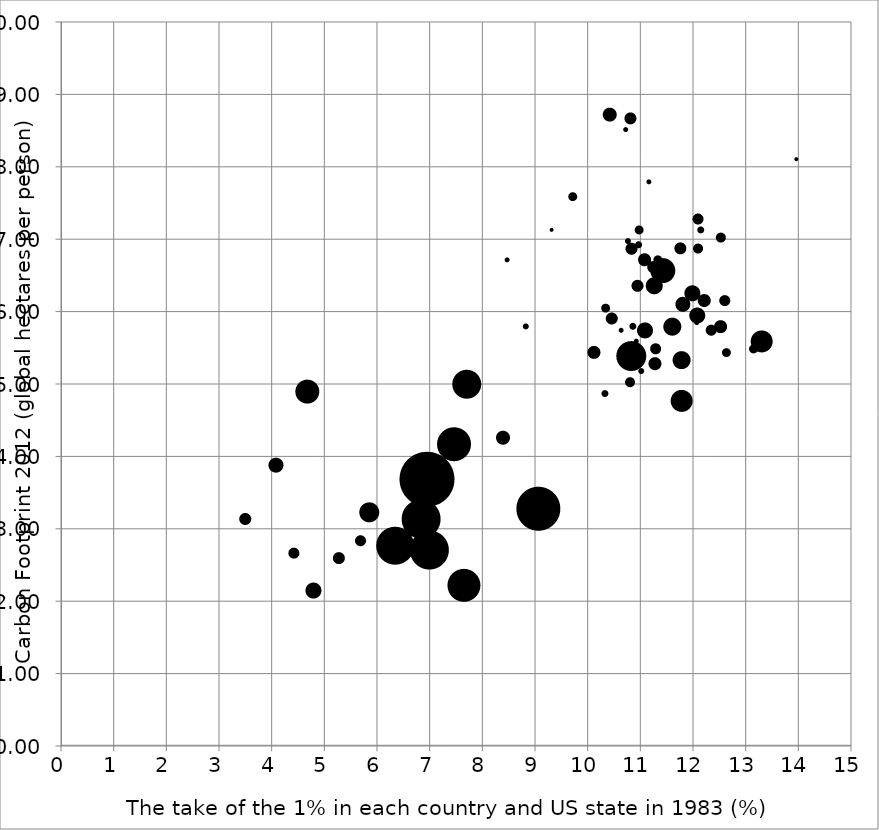
| Category | Series 0 |
|---|---|
| 12.342149 | 5.746 |
| 8.4618807 | 6.721 |
| 11.272208 | 5.284 |
| 12.627508 | 5.438 |
| 10.827101 | 5.387 |
| 10.823525 | 6.875 |
| 12.519849 | 7.029 |
| 10.718918 | 8.517 |
| 13.960412 | 8.106 |
| 13.298127 | 5.592 |
| 12.073452 | 5.951 |
| 8.8225587 | 5.797 |
| 10.319641 | 4.874 |
| 11.599077 | 5.797 |
| 11.073858 | 6.721 |
| 10.971814 | 7.131 |
| 11.324685 | 6.721 |
| 12.086685 | 7.285 |
| 12.596983 | 6.157 |
| 11.013192 | 5.182 |
| 10.809328 | 8.67 |
| 12.208504 | 6.157 |
| 11.079764 | 5.746 |
| 10.938519 | 6.362 |
| 13.142256 | 5.49 |
| 11.757833 | 6.875 |
| 10.921436 | 5.592 |
| 10.963338 | 6.926 |
| 10.332483 | 6.054 |
| 10.759662 | 6.977 |
| 11.801322 | 6.105 |
| 10.857477 | 5.797 |
| 11.7783 | 4.771 |
| 11.979431 | 6.259 |
| 11.154256 | 7.798 |
| 11.258063 | 6.362 |
| 12.09054 | 6.875 |
| 10.800268 | 5.028 |
| 11.774806 | 5.336 |
| 12.069936 | 5.849 |
| 11.285991 | 5.49 |
| 10.630249 | 5.746 |
| 12.516923 | 5.797 |
| 11.42572 | 6.567 |
| 9.7092366 | 7.593 |
| 10.723032 | 5.233 |
| 10.41725 | 8.722 |
| 10.116898 | 5.438 |
| 12.142691 | 7.131 |
| 11.23925 | 6.618 |
| 9.311722 | 7.131 |
| 4.67 | 4.9 |
| 7.7 | 5 |
| 5.27 | 2.6 |
| 3.49 | 3.141 |
| 6.99 | 2.71 |
| 9.06 | 3.28 |
| 7.05 | 3.22 |
| 6.34 | 2.77 |
| 6.94 | 3.69 |
| 7.46 | 4.17 |
| 5.85 | 3.23 |
| 5.68 | 2.84 |
| 4.42 | 2.665 |
| 4.79 | 2.15 |
| 10.45 | 5.91 |
| 7.65 | 2.22 |
| 4.08 | 3.88 |
| 8.39 | 4.26 |
| 6.83 | 3.14 |